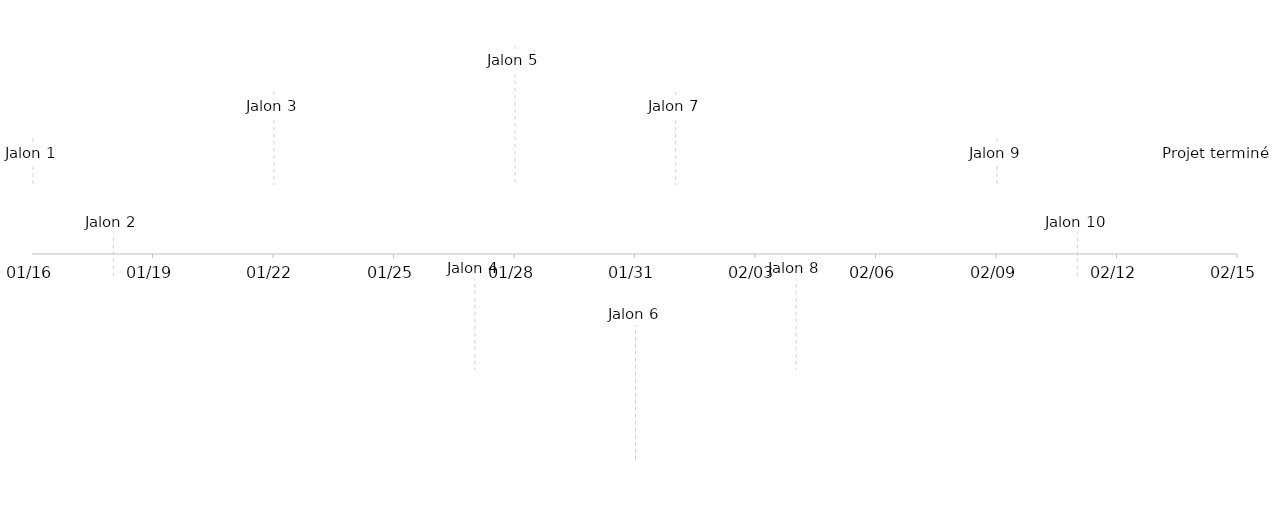
| Category | Series 1 |
|---|---|
| Jalon 1 | 5 |
| Jalon 2 | -5 |
| Jalon 3 | 10 |
| Jalon 4 | -10 |
| Jalon 5 | 15 |
| Jalon 6 | -15 |
| Jalon 7 | 10 |
| Jalon 8 | -10 |
| Jalon 9 | 5 |
| Jalon 10 | -5 |
| Projet terminé | 5 |